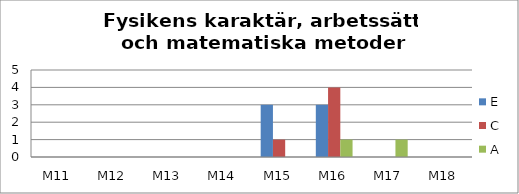
| Category | E | C | A |
|---|---|---|---|
| M11 | 0 | 0 | 0 |
| M12 | 0 | 0 | 0 |
| M13 | 0 | 0 | 0 |
| M14 | 0 | 0 | 0 |
| M15 | 3 | 1 | 0 |
| M16 | 3 | 4 | 1 |
| M17 | 0 | 0 | 1 |
| M18 | 0 | 0 | 0 |